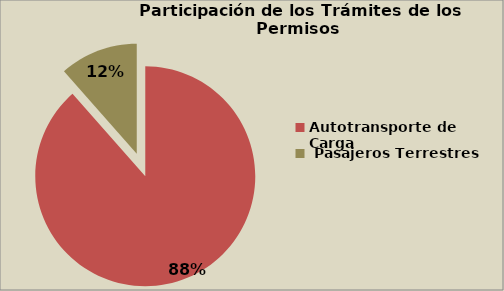
| Category | Series 0 |
|---|---|
| Autotransporte de Carga  | 88.493 |
|  Pasajeros Terrestres | 11.507 |